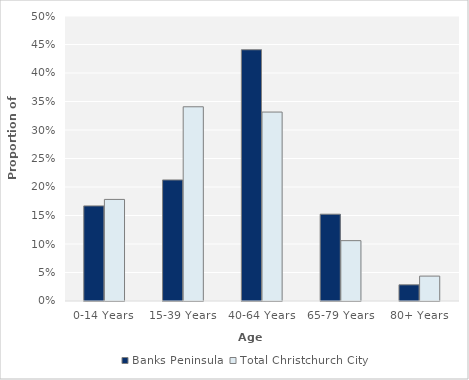
| Category | Banks Peninsula | Total Christchurch City |
|---|---|---|
| 0-14 Years | 0.167 | 0.178 |
| 15-39 Years | 0.212 | 0.341 |
| 40-64 Years | 0.441 | 0.331 |
| 65-79 Years | 0.152 | 0.106 |
| 80+ Years | 0.028 | 0.044 |